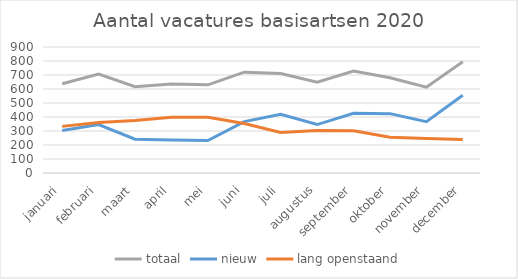
| Category | totaal | nieuw | lang openstaand |
|---|---|---|---|
| januari | 637 | 304 | 333 |
| februari | 706 | 346 | 360 |
| maart | 616 | 241 | 375 |
| april | 635 | 236 | 399 |
| mei | 630 | 232 | 398 |
| juni | 720 | 367 | 353 |
| juli | 710 | 420 | 290 |
| augustus | 649 | 346 | 303 |
| september | 728 | 426 | 302 |
| oktober | 680 | 424 | 256 |
| november | 613 | 366 | 247 |
| december | 795 | 555 | 240 |